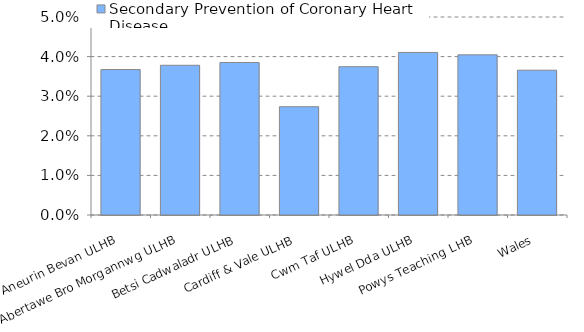
| Category | Secondary Prevention of Coronary Heart Disease  |
|---|---|
| Aneurin Bevan ULHB | 0.037 |
| Abertawe Bro Morgannwg ULHB | 0.038 |
| Betsi Cadwaladr ULHB | 0.039 |
| Cardiff & Vale ULHB | 0.027 |
| Cwm Taf ULHB | 0.037 |
| Hywel Dda ULHB | 0.041 |
| Powys Teaching LHB | 0.04 |
| Wales | 0.037 |